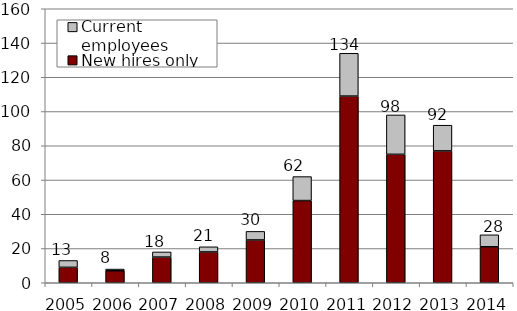
| Category | New hires only | Current employees |
|---|---|---|
| 2005.0 | 9 | 4 |
| 2006.0 | 7 | 1 |
| 2007.0 | 15 | 3 |
| 2008.0 | 18 | 3 |
| 2009.0 | 25 | 5 |
| 2010.0 | 48 | 14 |
| 2011.0 | 109 | 25 |
| 2012.0 | 75 | 23 |
| 2013.0 | 77 | 15 |
| 2014.0 | 21 | 7 |